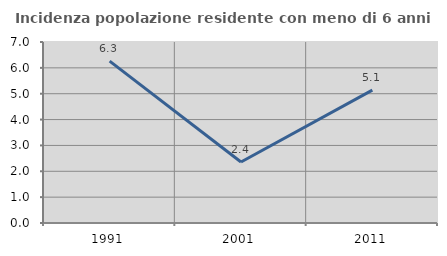
| Category | Incidenza popolazione residente con meno di 6 anni |
|---|---|
| 1991.0 | 6.259 |
| 2001.0 | 2.358 |
| 2011.0 | 5.136 |